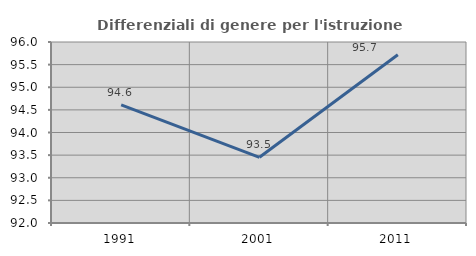
| Category | Differenziali di genere per l'istruzione superiore |
|---|---|
| 1991.0 | 94.612 |
| 2001.0 | 93.452 |
| 2011.0 | 95.718 |